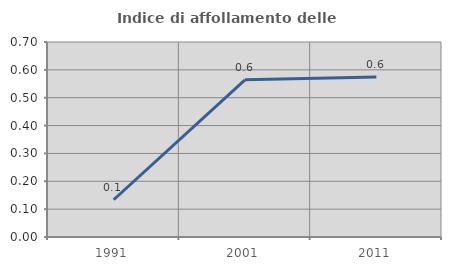
| Category | Indice di affollamento delle abitazioni  |
|---|---|
| 1991.0 | 0.134 |
| 2001.0 | 0.564 |
| 2011.0 | 0.575 |